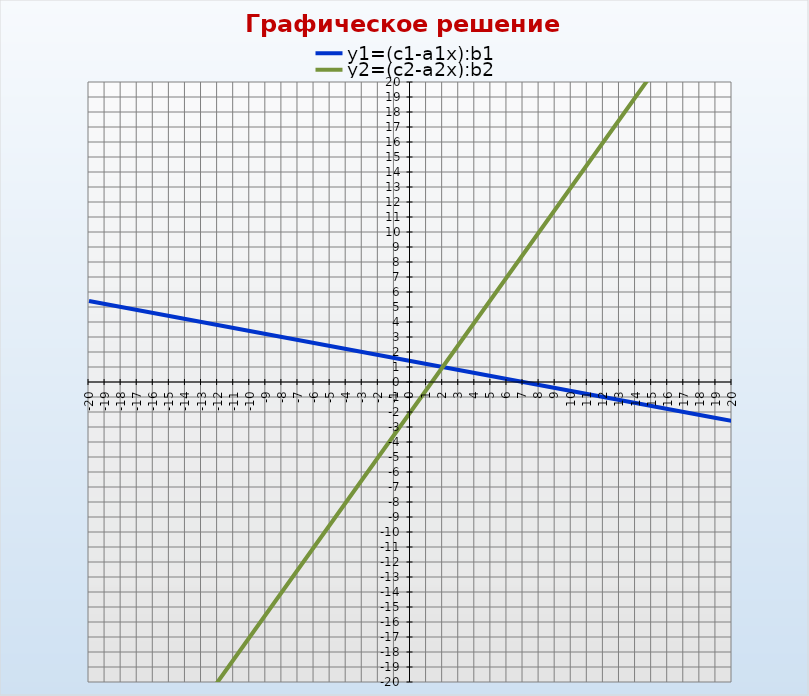
| Category | y1=(с1-a1x):b1 | y2=(с2-a2x):b2 |
|---|---|---|
| -20.0 | 5.4 | -32 |
| -19.0 | 5.2 | -30.5 |
| -18.0 | 5 | -29 |
| -17.0 | 4.8 | -27.5 |
| -16.0 | 4.6 | -26 |
| -15.0 | 4.4 | -24.5 |
| -14.0 | 4.2 | -23 |
| -13.0 | 4 | -21.5 |
| -12.0 | 3.8 | -20 |
| -11.0 | 3.6 | -18.5 |
| -10.0 | 3.4 | -17 |
| -9.0 | 3.2 | -15.5 |
| -8.0 | 3 | -14 |
| -7.0 | 2.8 | -12.5 |
| -6.0 | 2.6 | -11 |
| -5.0 | 2.4 | -9.5 |
| -4.0 | 2.2 | -8 |
| -3.0 | 2 | -6.5 |
| -2.0 | 1.8 | -5 |
| -1.0 | 1.6 | -3.5 |
| 0.0 | 1.4 | -2 |
| 1.0 | 1.2 | -0.5 |
| 2.0 | 1 | 1 |
| 3.0 | 0.8 | 2.5 |
| 4.0 | 0.6 | 4 |
| 5.0 | 0.4 | 5.5 |
| 6.0 | 0.2 | 7 |
| 7.0 | 0 | 8.5 |
| 8.0 | -0.2 | 10 |
| 9.0 | -0.4 | 11.5 |
| 10.0 | -0.6 | 13 |
| 11.0 | -0.8 | 14.5 |
| 12.0 | -1 | 16 |
| 13.0 | -1.2 | 17.5 |
| 14.0 | -1.4 | 19 |
| 15.0 | -1.6 | 20.5 |
| 16.0 | -1.8 | 22 |
| 17.0 | -2 | 23.5 |
| 18.0 | -2.2 | 25 |
| 19.0 | -2.4 | 26.5 |
| 20.0 | -2.6 | 28 |